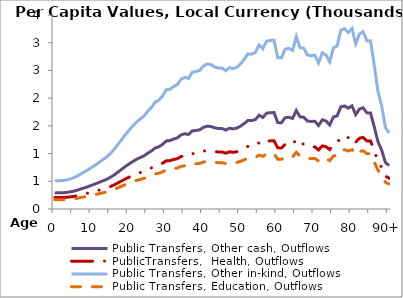
| Category | Public Transfers, Other cash, Outflows | PublicTransfers,  Health, Outflows | Public Transfers, Other in-kind, Outflows | Public Transfers, Education, Outflows |
|---|---|---|---|---|
| 0 | 290.477 | 205.565 | 508.526 | 167.081 |
|  | 291.511 | 206.297 | 510.338 | 167.677 |
| 2 | 292.546 | 207.029 | 512.149 | 168.272 |
| 3 | 296.956 | 210.15 | 519.87 | 170.808 |
| 4 | 307.884 | 217.884 | 539.001 | 177.094 |
| 5 | 320.715 | 226.964 | 561.463 | 184.474 |
| 6 | 338.169 | 239.316 | 592.019 | 194.514 |
| 7 | 361.865 | 256.085 | 633.504 | 208.144 |
| 8 | 382.811 | 270.908 | 670.172 | 220.192 |
| 9 | 406.114 | 287.399 | 710.967 | 233.595 |
| 10 | 430.529 | 304.677 | 753.71 | 247.639 |
| 11 | 456.221 | 322.859 | 798.688 | 262.417 |
| 12 | 483.121 | 341.896 | 845.781 | 277.89 |
| 13 | 510.587 | 361.333 | 893.865 | 293.688 |
| 14 | 537.018 | 380.038 | 940.137 | 308.891 |
| 15 | 573.481 | 405.842 | 1003.971 | 329.865 |
| 16 | 616.697 | 436.425 | 1079.626 | 354.722 |
| 17 | 666.557 | 471.71 | 1166.915 | 383.402 |
| 18 | 716.059 | 506.742 | 1253.577 | 411.875 |
| 19 | 767.519 | 543.159 | 1343.666 | 441.475 |
| 20 | 812.763 | 575.177 | 1422.872 | 467.499 |
| 21 | 855.316 | 605.291 | 1497.368 | 491.975 |
| 22 | 897.552 | 635.181 | 1571.309 | 516.269 |
| 23 | 927.93 | 656.679 | 1624.49 | 533.743 |
| 24 | 958.962 | 678.639 | 1678.817 | 551.592 |
| 25 | 1007.139 | 712.734 | 1763.159 | 579.304 |
| 26 | 1046.537 | 740.615 | 1832.132 | 601.965 |
| 27 | 1100.174 | 778.573 | 1926.031 | 632.817 |
| 28 | 1121.823 | 793.893 | 1963.932 | 645.27 |
| 29 | 1166.063 | 825.201 | 2041.38 | 670.716 |
| 30 | 1227.95 | 868.997 | 2149.723 | 706.313 |
| 31 | 1233.673 | 873.047 | 2159.742 | 709.605 |
| 32 | 1263.075 | 893.855 | 2211.216 | 726.517 |
| 33 | 1283.531 | 908.331 | 2247.028 | 738.284 |
| 34 | 1338.354 | 947.128 | 2343.003 | 769.817 |
| 35 | 1356.61 | 960.048 | 2374.964 | 780.318 |
| 36 | 1345.063 | 951.876 | 2354.749 | 773.676 |
| 37 | 1409.632 | 997.57 | 2467.788 | 810.817 |
| 38 | 1416.756 | 1002.612 | 2480.259 | 814.914 |
| 39 | 1428.577 | 1010.977 | 2500.954 | 821.714 |
| 40 | 1472.979 | 1042.4 | 2578.687 | 847.254 |
| 41 | 1494.564 | 1057.675 | 2616.475 | 859.669 |
| 42 | 1488.733 | 1053.549 | 2606.267 | 856.315 |
| 43 | 1464.386 | 1036.318 | 2563.642 | 842.311 |
| 44 | 1452.182 | 1027.682 | 2542.278 | 835.291 |
| 45 | 1453.013 | 1028.27 | 2543.733 | 835.769 |
| 46 | 1424.133 | 1007.833 | 2493.174 | 819.158 |
| 47 | 1456.815 | 1030.961 | 2550.389 | 837.956 |
| 48 | 1445.233 | 1022.765 | 2530.113 | 831.294 |
| 49 | 1460.11 | 1033.293 | 2556.158 | 839.851 |
| 50 | 1495.99 | 1058.684 | 2618.971 | 860.489 |
| 51 | 1542.648 | 1091.703 | 2700.653 | 887.327 |
| 52 | 1598.543 | 1131.259 | 2798.506 | 919.477 |
| 53 | 1595.595 | 1129.173 | 2793.346 | 917.782 |
| 54 | 1613.722 | 1142.001 | 2825.08 | 928.208 |
| 55 | 1691.73 | 1197.206 | 2961.645 | 973.078 |
| 56 | 1651.699 | 1168.877 | 2891.565 | 950.053 |
| 57 | 1729.154 | 1223.69 | 3027.162 | 994.605 |
| 58 | 1736.857 | 1229.142 | 3040.648 | 999.036 |
| 59 | 1739.654 | 1231.121 | 3045.544 | 1000.644 |
| 60 | 1559.058 | 1103.316 | 2729.382 | 896.766 |
| 61 | 1556.948 | 1101.823 | 2725.688 | 895.552 |
| 62 | 1646.534 | 1165.221 | 2882.522 | 947.082 |
| 63 | 1655.92 | 1171.864 | 2898.954 | 952.481 |
| 64 | 1633.792 | 1156.204 | 2860.215 | 939.752 |
| 65 | 1778.608 | 1258.688 | 3113.739 | 1023.05 |
| 66 | 1662.213 | 1176.317 | 2909.972 | 956.101 |
| 67 | 1657.544 | 1173.013 | 2901.798 | 953.415 |
| 68 | 1587.702 | 1123.587 | 2779.528 | 913.242 |
| 69 | 1579.382 | 1117.699 | 2764.963 | 908.456 |
| 70 | 1583.451 | 1120.579 | 2772.086 | 910.797 |
| 71 | 1505.604 | 1065.488 | 2635.802 | 866.019 |
| 72 | 1609.597 | 1139.082 | 2817.858 | 925.836 |
| 73 | 1587.177 | 1123.216 | 2778.609 | 912.94 |
| 74 | 1515.794 | 1072.699 | 2653.641 | 871.881 |
| 75 | 1660.945 | 1175.42 | 2907.751 | 955.371 |
| 76 | 1680.19 | 1189.039 | 2941.443 | 966.441 |
| 77 | 1842.177 | 1303.674 | 3225.027 | 1059.615 |
| 78 | 1858.702 | 1315.369 | 3253.957 | 1069.121 |
| 79 | 1818.969 | 1287.25 | 3184.397 | 1046.266 |
| 80 | 1860.374 | 1316.552 | 3256.884 | 1070.082 |
| 81 | 1702.41 | 1204.763 | 2980.342 | 979.221 |
| 82 | 1803.963 | 1276.631 | 3158.127 | 1037.634 |
| 83 | 1826.951 | 1292.899 | 3198.372 | 1050.857 |
| 84 | 1735.043 | 1227.858 | 3037.472 | 997.992 |
| 85 | 1731.483 | 1225.338 | 3031.24 | 995.944 |
| 86 | 1478.387 | 1046.227 | 2588.154 | 850.364 |
| 87 | 1211.847 | 857.602 | 2121.533 | 697.051 |
| 88 | 1060.423 | 750.442 | 1856.441 | 609.952 |
| 89 | 839.317 | 593.969 | 1469.359 | 482.773 |
| 90+ | 783.27 | 554.305 | 1371.239 | 450.535 |